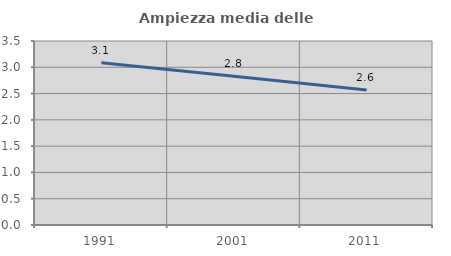
| Category | Ampiezza media delle famiglie |
|---|---|
| 1991.0 | 3.087 |
| 2001.0 | 2.829 |
| 2011.0 | 2.569 |